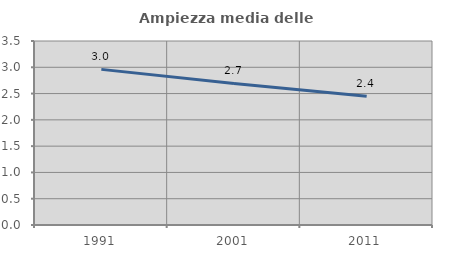
| Category | Ampiezza media delle famiglie |
|---|---|
| 1991.0 | 2.96 |
| 2001.0 | 2.692 |
| 2011.0 | 2.447 |